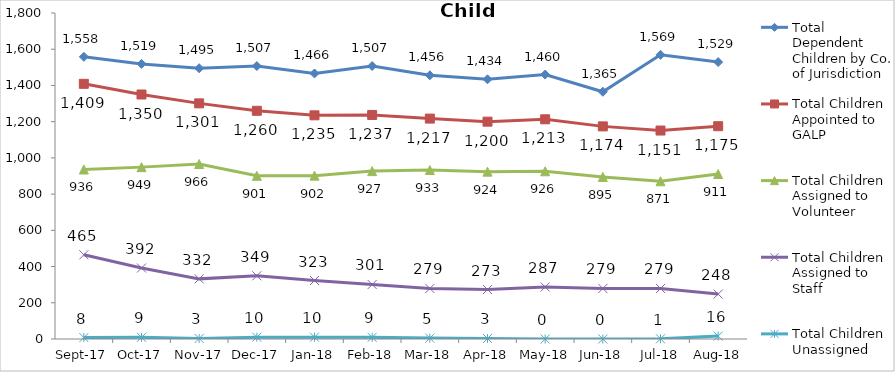
| Category | Total Dependent Children by Co. of Jurisdiction | Total Children Appointed to GALP | Total Children Assigned to Volunteer | Total Children Assigned to Staff | Total Children Unassigned |
|---|---|---|---|---|---|
| 2017-09-01 | 1558 | 1409 | 936 | 465 | 8 |
| 2017-10-01 | 1519 | 1350 | 949 | 392 | 9 |
| 2017-11-01 | 1495 | 1301 | 966 | 332 | 3 |
| 2017-12-01 | 1507 | 1260 | 901 | 349 | 10 |
| 2018-01-01 | 1466 | 1235 | 902 | 323 | 10 |
| 2018-02-01 | 1507 | 1237 | 927 | 301 | 9 |
| 2018-03-01 | 1456 | 1217 | 933 | 279 | 5 |
| 2018-04-01 | 1434 | 1200 | 924 | 273 | 3 |
| 2018-05-01 | 1460 | 1213 | 926 | 287 | 0 |
| 2018-06-01 | 1365 | 1174 | 895 | 279 | 0 |
| 2018-07-01 | 1569 | 1151 | 871 | 279 | 1 |
| 2018-08-01 | 1529 | 1175 | 911 | 248 | 16 |